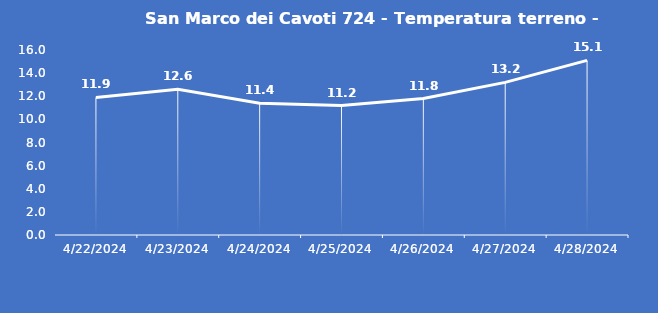
| Category | San Marco dei Cavoti 724 - Temperatura terreno - Grezzo (°C) |
|---|---|
| 4/22/24 | 11.9 |
| 4/23/24 | 12.6 |
| 4/24/24 | 11.4 |
| 4/25/24 | 11.2 |
| 4/26/24 | 11.8 |
| 4/27/24 | 13.2 |
| 4/28/24 | 15.1 |